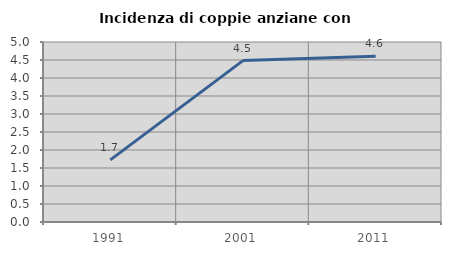
| Category | Incidenza di coppie anziane con figli |
|---|---|
| 1991.0 | 1.726 |
| 2001.0 | 4.483 |
| 2011.0 | 4.604 |